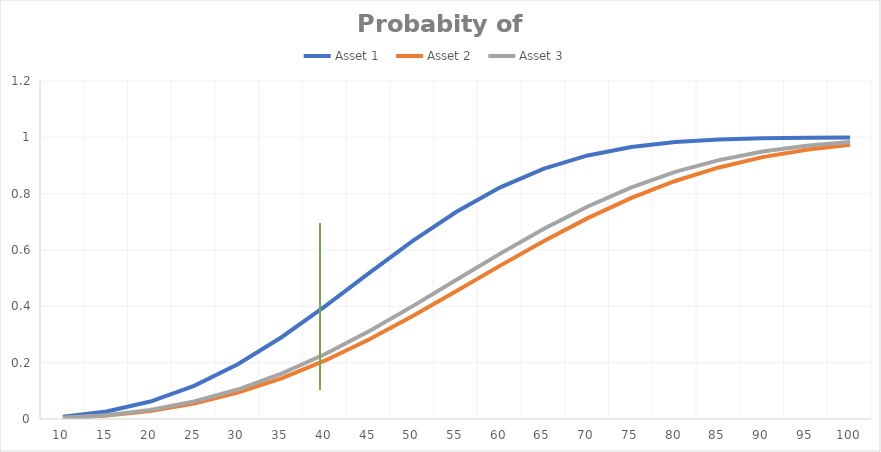
| Category | Asset 1 | Asset 2 | Asset 3 |
|---|---|---|---|
| 10.0 | 0.008 | 0.004 | 0.004 |
| 15.0 | 0.027 | 0.012 | 0.014 |
| 20.0 | 0.062 | 0.029 | 0.032 |
| 25.0 | 0.118 | 0.055 | 0.062 |
| 30.0 | 0.194 | 0.094 | 0.105 |
| 35.0 | 0.29 | 0.145 | 0.161 |
| 40.0 | 0.401 | 0.208 | 0.231 |
| 45.0 | 0.518 | 0.282 | 0.312 |
| 50.0 | 0.632 | 0.366 | 0.401 |
| 55.0 | 0.736 | 0.454 | 0.494 |
| 60.0 | 0.822 | 0.545 | 0.587 |
| 65.0 | 0.889 | 0.632 | 0.675 |
| 70.0 | 0.936 | 0.713 | 0.755 |
| 75.0 | 0.966 | 0.785 | 0.822 |
| 80.0 | 0.983 | 0.845 | 0.877 |
| 85.0 | 0.993 | 0.893 | 0.919 |
| 90.0 | 0.997 | 0.93 | 0.95 |
| 95.0 | 0.999 | 0.956 | 0.97 |
| 100.0 | 1 | 0.974 | 0.983 |